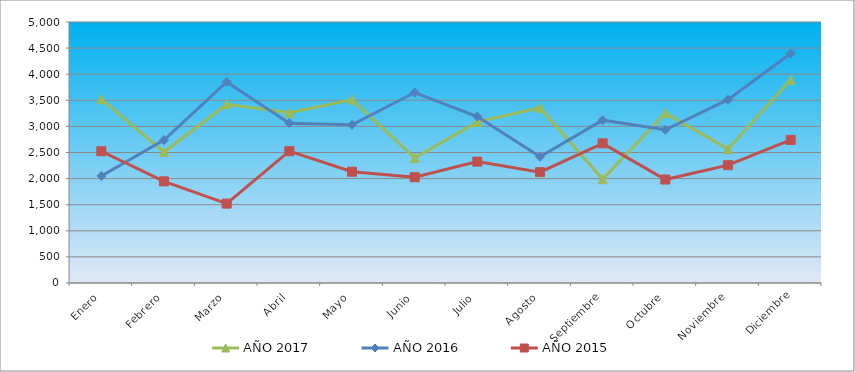
| Category | AÑO 2017 | AÑO 2016 | AÑO 2015 |
|---|---|---|---|
| Enero | 3522 | 2049 | 2524 |
| Febrero | 2509 | 2737 | 1947 |
| Marzo | 3424 | 3853 | 1520 |
| Abril | 3261 | 3062 | 2525 |
| Mayo | 3514 | 3030 | 2133 |
| Junio | 2395 | 3649 | 2026 |
| Julio | 3086 | 3190 | 2325 |
| Agosto | 3357 | 2417 | 2123 |
| Septiembre | 1988 | 3119 | 2675 |
| Octubre | 3255 | 2935 | 1982 |
| Noviembre | 2564 | 3513 | 2257 |
| Diciembre | 3895 | 4395 | 2741 |